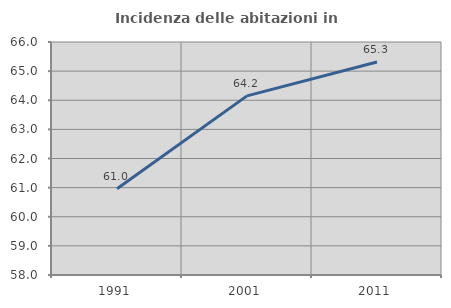
| Category | Incidenza delle abitazioni in proprietà  |
|---|---|
| 1991.0 | 60.963 |
| 2001.0 | 64.151 |
| 2011.0 | 65.312 |